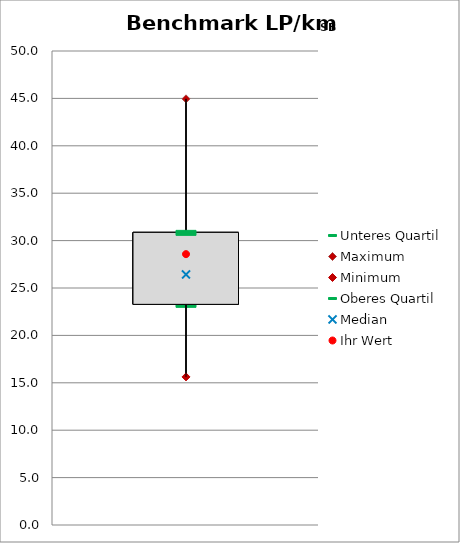
| Category | Unteres Quartil | Maximum | Minimum | Oberes Quartil |
|---|---|---|---|---|
| LP/kmSB | 23.276 | 44.953 | 15.621 | 30.869 |